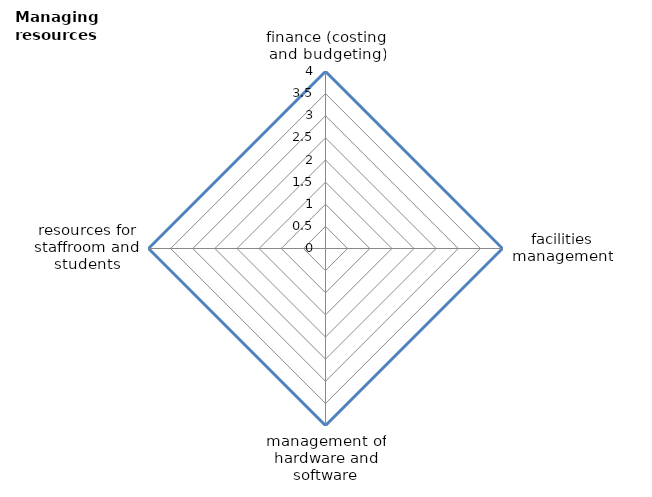
| Category | Series 0 | Series 1 |
|---|---|---|
| finance (costing and budgeting) | 4 | 0 |
| facilities management | 4 | 0 |
| management of hardware and software | 4 | 0 |
| resources for staffroom and students | 4 | 0 |